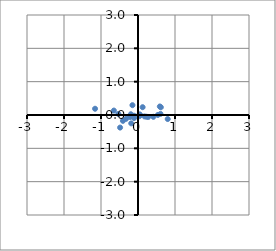
| Category | Series 0 |
|---|---|
| 0.5897791172539892 | 0.256 |
| 0.2767355408853809 | -0.058 |
| 0.5383387743609006 | 0.003 |
| -0.18269163626614254 | -0.25 |
| -0.19393190890574913 | 0.023 |
| 0.05089039306274351 | 0.015 |
| 0.17607357480552874 | -0.043 |
| -0.21454410378890906 | -0.059 |
| -0.48383573876862973 | -0.377 |
| 0.8029568913017581 | -0.121 |
| -0.3214897780165869 | -0.114 |
| -0.5307321579086322 | 0.03 |
| 0.2318066423264545 | -0.052 |
| 0.4154041008326578 | -0.054 |
| 0.03995844955449478 | -0.034 |
| 0.6076341818740236 | 0.034 |
| -0.10606636458261554 | -0.022 |
| -0.4077959990806097 | -0.175 |
| -0.10619347024936901 | -0.091 |
| -0.14997604760319042 | 0.294 |
| -0.6518029369401608 | 0.133 |
| -1.1605035575171052 | 0.188 |
| 0.1249104056505001 | 0.234 |
| 0.6171349111091589 | 0.233 |
| 0.03794071661010978 | 0.011 |